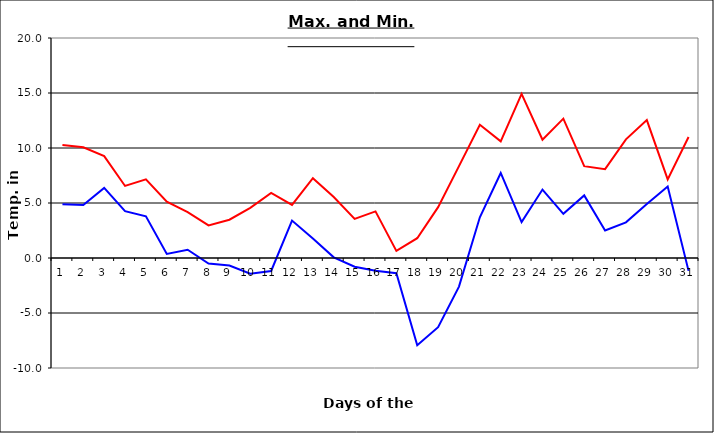
| Category | Series 0 | Series 1 |
|---|---|---|
| 0 | 10.27 | 4.89 |
| 1 | 10.07 | 4.81 |
| 2 | 9.26 | 6.37 |
| 3 | 6.55 | 4.26 |
| 4 | 7.15 | 3.79 |
| 5 | 5.12 | 0.37 |
| 6 | 4.17 | 0.75 |
| 7 | 2.96 | -0.5 |
| 8 | 3.48 | -0.69 |
| 9 | 4.56 | -1.42 |
| 10 | 5.92 | -1.18 |
| 11 | 4.82 | 3.4 |
| 12 | 7.25 | 1.77 |
| 13 | 5.54 | 0.06 |
| 14 | 3.56 | -0.79 |
| 15 | 4.24 | -1.15 |
| 16 | 0.64 | -1.38 |
| 17 | 1.8 | -7.93 |
| 18 | 4.62 | -6.29 |
| 19 | 8.35 | -2.6 |
| 20 | 12.12 | 3.7 |
| 21 | 10.6 | 7.73 |
| 22 | 14.92 | 3.26 |
| 23 | 10.75 | 6.22 |
| 24 | 12.67 | 4.02 |
| 25 | 8.35 | 5.69 |
| 26 | 8.08 | 2.5 |
| 27 | 10.79 | 3.24 |
| 28 | 12.54 | 4.9 |
| 29 | 7.15 | 6.5 |
| 30 | 11 | -1.17 |